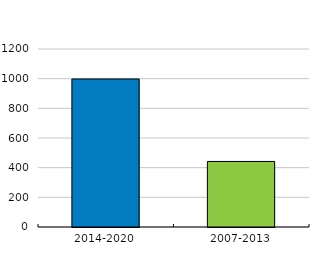
| Category | Series 0 |
|---|---|
| 2014-2020 | 998.017 |
| 2007-2013 | 441.863 |